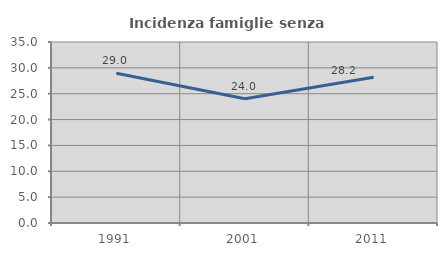
| Category | Incidenza famiglie senza nuclei |
|---|---|
| 1991.0 | 28.972 |
| 2001.0 | 24.042 |
| 2011.0 | 28.191 |